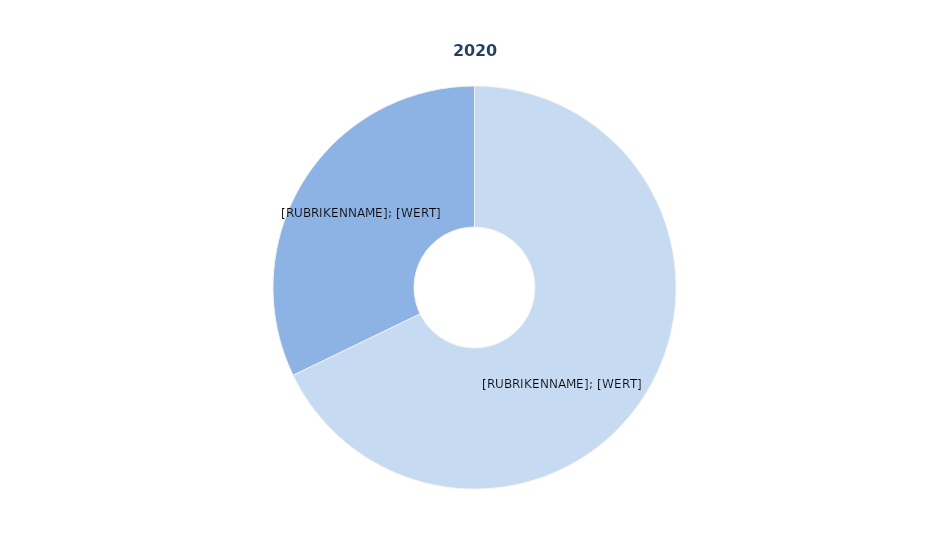
| Category | Series 1 |
|---|---|
| Vollzeitbeschäftigte | 0.678 |
| Teilzeitbeschäftigte | 0.322 |